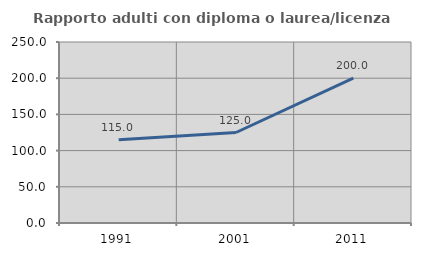
| Category | Rapporto adulti con diploma o laurea/licenza media  |
|---|---|
| 1991.0 | 115 |
| 2001.0 | 125 |
| 2011.0 | 200 |